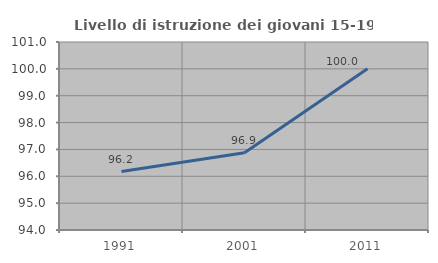
| Category | Livello di istruzione dei giovani 15-19 anni |
|---|---|
| 1991.0 | 96.175 |
| 2001.0 | 96.875 |
| 2011.0 | 100 |